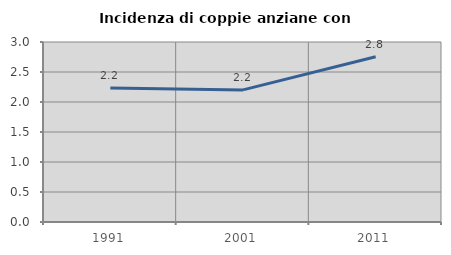
| Category | Incidenza di coppie anziane con figli |
|---|---|
| 1991.0 | 2.232 |
| 2001.0 | 2.202 |
| 2011.0 | 2.754 |